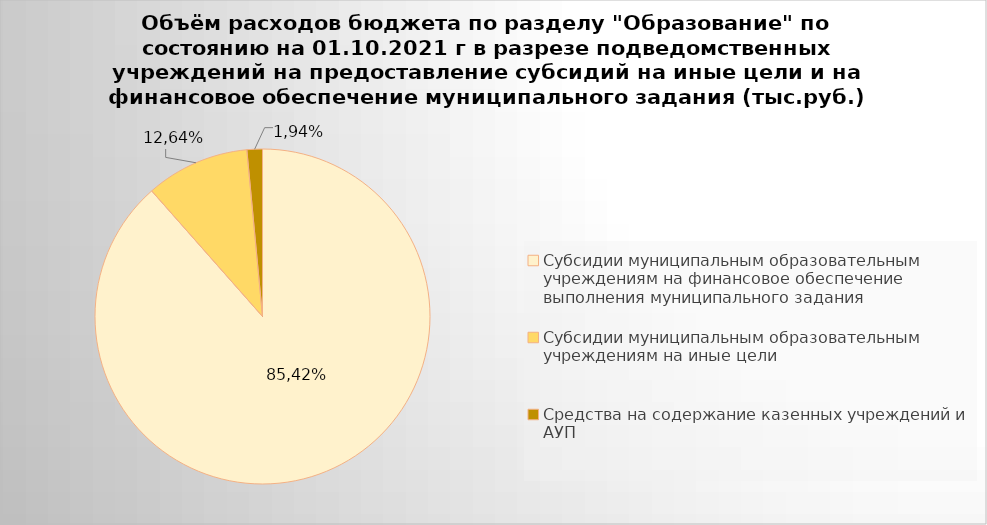
| Category | Series 0 |
|---|---|
| Субсидии муниципальным образовательным учреждениям на финансовое обеспечение выполнения муниципального задания | 6050807.76 |
| Субсидии муниципальным образовательным учреждениям на иные цели | 684946.33 |
| Средства на содержание казенных учреждений и АУП | 102035.01 |